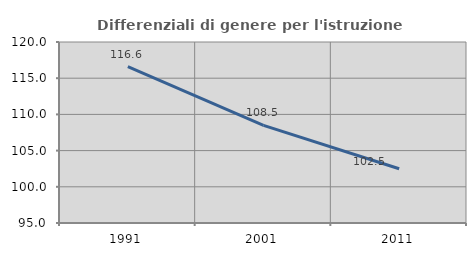
| Category | Differenziali di genere per l'istruzione superiore |
|---|---|
| 1991.0 | 116.607 |
| 2001.0 | 108.486 |
| 2011.0 | 102.486 |